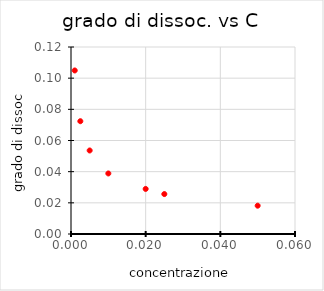
| Category | a vs C |
|---|---|
| 0.001 | 0.105 |
| 0.0025 | 0.072 |
| 0.005 | 0.054 |
| 0.01 | 0.039 |
| 0.02 | 0.029 |
| 0.025 | 0.026 |
| 0.05 | 0.018 |